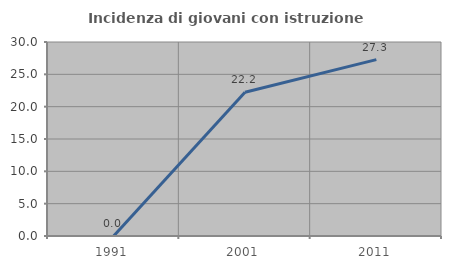
| Category | Incidenza di giovani con istruzione universitaria |
|---|---|
| 1991.0 | 0 |
| 2001.0 | 22.222 |
| 2011.0 | 27.273 |